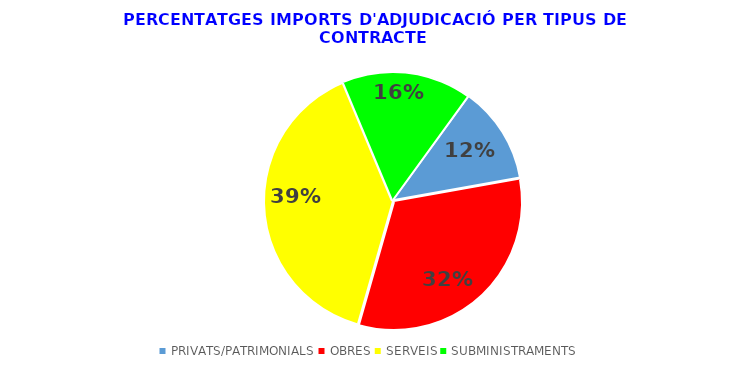
| Category | Series 0 |
|---|---|
| PRIVATS/PATRIMONIALS | 0.122 |
| OBRES | 0.322 |
| SERVEIS | 0.393 |
| SUBMINISTRAMENTS | 0.163 |